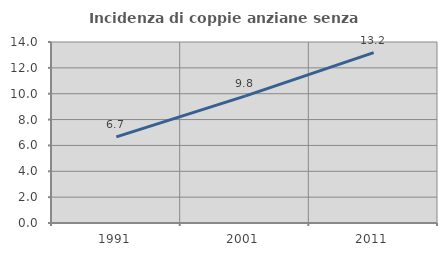
| Category | Incidenza di coppie anziane senza figli  |
|---|---|
| 1991.0 | 6.667 |
| 2001.0 | 9.814 |
| 2011.0 | 13.176 |